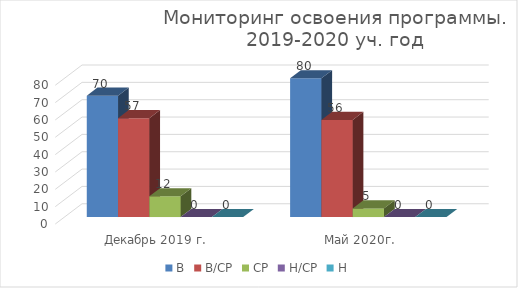
| Category | В | В/СР | СР | Н/СР | Н |
|---|---|---|---|---|---|
| Декабрь 2019 г. | 70 | 57 | 12 | 0 | 0 |
| Май 2020г. | 80 | 56 | 5 | 0 | 0 |